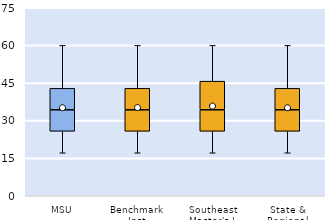
| Category | 25th | 50th | 75th |
|---|---|---|---|
| MSU | 25.714 | 8.571 | 8.571 |
| Benchmark Inst | 25.714 | 8.571 | 8.571 |
| Southeast Master's-L | 25.714 | 8.571 | 11.429 |
| State & Regional | 25.714 | 8.571 | 8.571 |